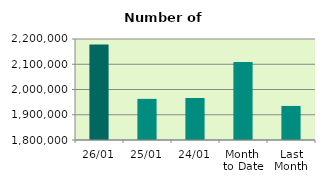
| Category | Series 0 |
|---|---|
| 26/01 | 2178430 |
| 25/01 | 1962850 |
| 24/01 | 1966278 |
| Month 
to Date | 2108641.368 |
| Last
Month | 1934937.048 |